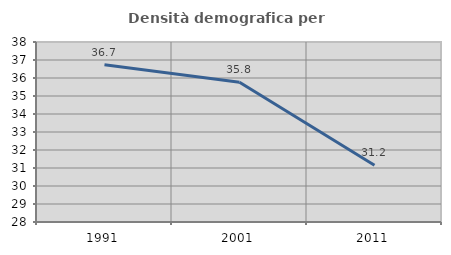
| Category | Densità demografica |
|---|---|
| 1991.0 | 36.731 |
| 2001.0 | 35.769 |
| 2011.0 | 31.154 |